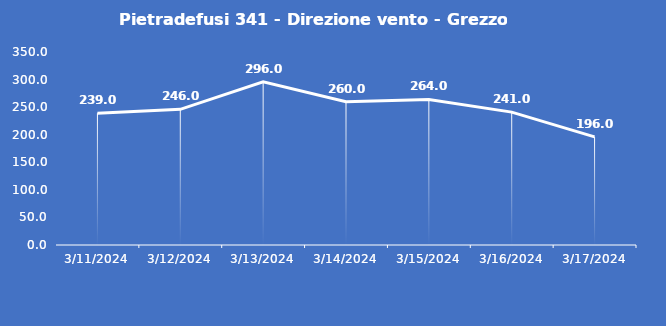
| Category | Pietradefusi 341 - Direzione vento - Grezzo (°N) |
|---|---|
| 3/11/24 | 239 |
| 3/12/24 | 246 |
| 3/13/24 | 296 |
| 3/14/24 | 260 |
| 3/15/24 | 264 |
| 3/16/24 | 241 |
| 3/17/24 | 196 |